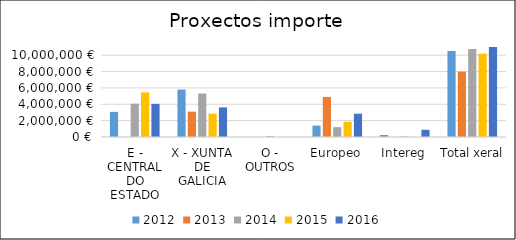
| Category | 2012 | 2013 | 2014 | 2015 | 2016 |
|---|---|---|---|---|---|
| E - CENTRAL DO ESTADO | 3072197 | 0 | 4069609.34 | 5456349.24 | 4049876 |
| X - XUNTA DE GALICIA | 5797841.07 | 3097800 | 5312000 | 2860000 | 3619814.03 |
| O - OUTROS | 0 | 0 | 108000 | 19954.57 | 0 |
| Europeo | 1388722.22 | 4893072.39 | 1201045.6 | 1855568.5 | 2848255 |
| Intereg | 244400 | 0 | 72020 | 0 | 881250 |
| Total xeral | 10503160.29 | 7990872.39 | 10762674.94 | 10191872.31 | 11399195.03 |